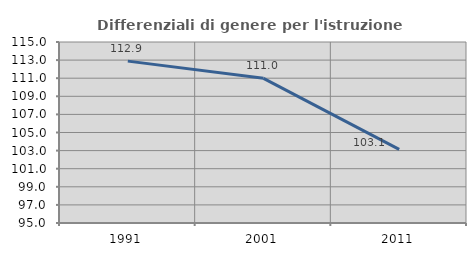
| Category | Differenziali di genere per l'istruzione superiore |
|---|---|
| 1991.0 | 112.887 |
| 2001.0 | 110.985 |
| 2011.0 | 103.139 |